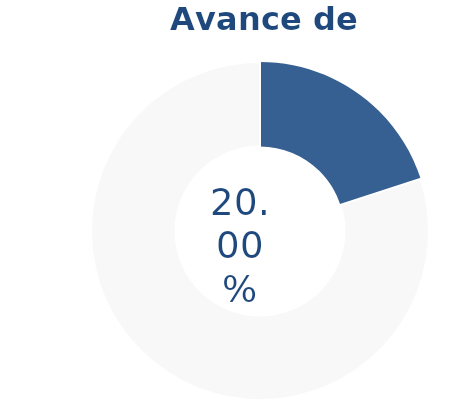
| Category | Series 0 |
|---|---|
| Acumulado 1 Trimestre | 0.2 |
| Año | -0.8 |